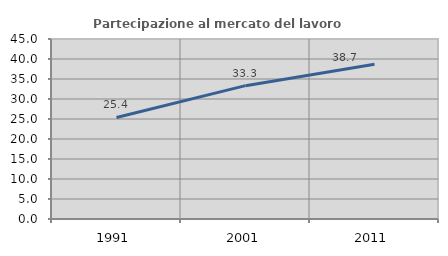
| Category | Partecipazione al mercato del lavoro  femminile |
|---|---|
| 1991.0 | 25.381 |
| 2001.0 | 33.333 |
| 2011.0 | 38.702 |